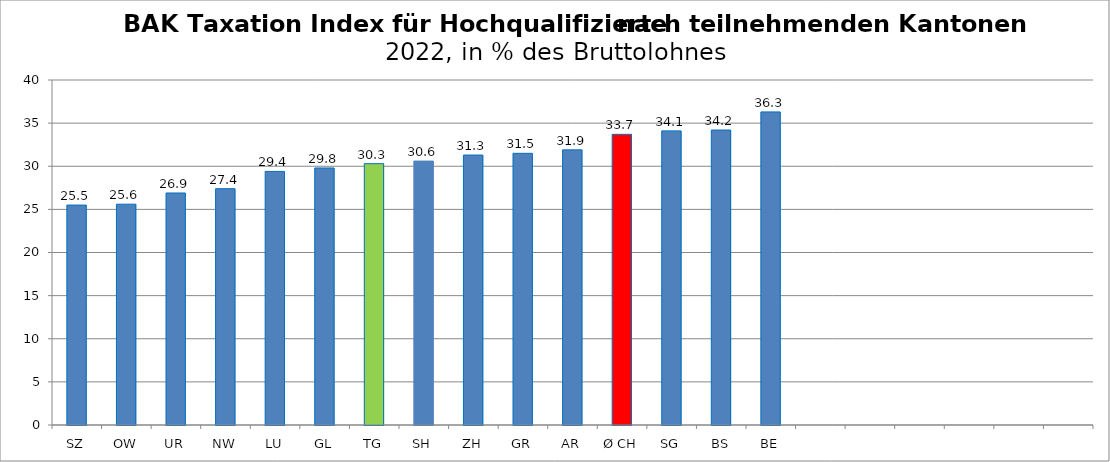
| Category | Series 0 |
|---|---|
| SZ | 25.5 |
| OW | 25.6 |
| UR | 26.9 |
| NW | 27.4 |
| LU | 29.4 |
| GL | 29.8 |
| TG | 30.3 |
| SH | 30.6 |
| ZH | 31.3 |
| GR | 31.5 |
| AR | 31.9 |
| Ø CH | 33.7 |
| SG | 34.1 |
| BS | 34.2 |
| BE | 36.3 |